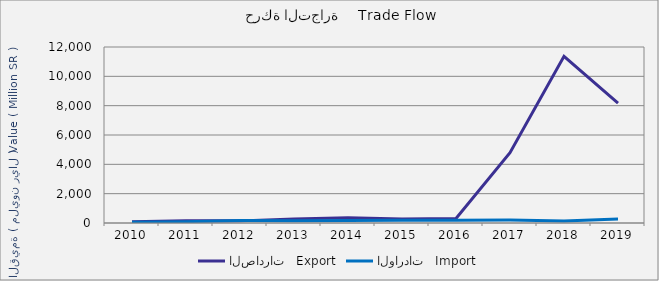
| Category | الصادرات   Export | الواردات   Import |
|---|---|---|
| 2010.0 | 81765687 | 57386470 |
| 2011.0 | 145423099 | 93556009 |
| 2012.0 | 144914096 | 164520507 |
| 2013.0 | 269248895 | 161808777 |
| 2014.0 | 360455721 | 164735509 |
| 2015.0 | 275052830 | 188841995 |
| 2016.0 | 303911644 | 180918657 |
| 2017.0 | 4789186055 | 196362692 |
| 2018.0 | 11367690155 | 142249996 |
| 2019.0 | 8180820744 | 275517643 |